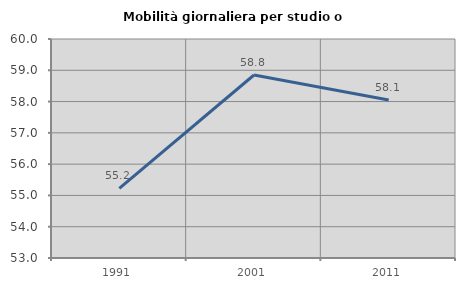
| Category | Mobilità giornaliera per studio o lavoro |
|---|---|
| 1991.0 | 55.227 |
| 2001.0 | 58.849 |
| 2011.0 | 58.051 |